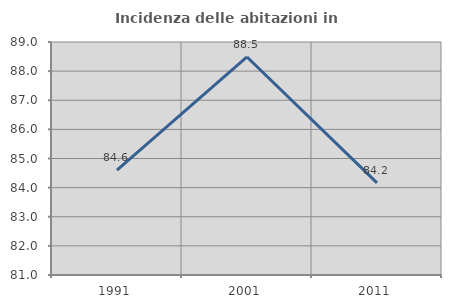
| Category | Incidenza delle abitazioni in proprietà  |
|---|---|
| 1991.0 | 84.602 |
| 2001.0 | 88.486 |
| 2011.0 | 84.161 |